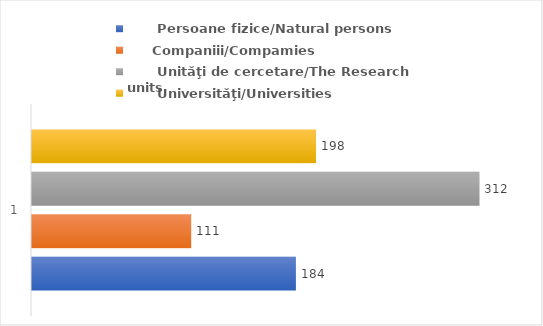
| Category |       Persoane fizice/Natural persons |      Companiii/Compamies |       Unităţi de cercetare/The Research units |       Universităţi/Universities |
|---|---|---|---|---|
| 0 | 184 | 111 | 312 | 198 |